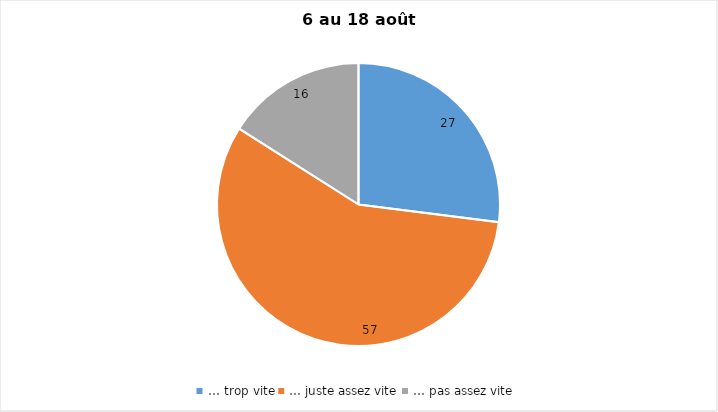
| Category | Series 0 |
|---|---|
| … trop vite | 27 |
| … juste assez vite | 57 |
| … pas assez vite | 16 |